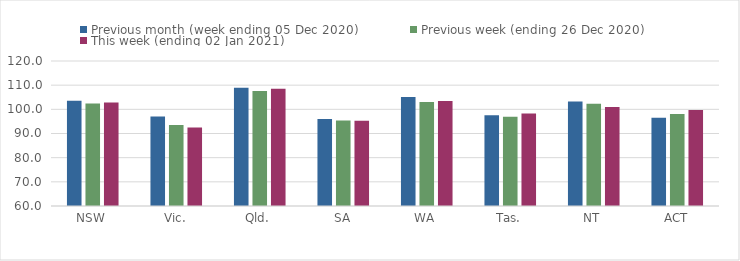
| Category | Previous month (week ending 05 Dec 2020) | Previous week (ending 26 Dec 2020) | This week (ending 02 Jan 2021) |
|---|---|---|---|
| NSW | 103.52 | 102.46 | 102.84 |
| Vic. | 97.01 | 93.55 | 92.44 |
| Qld. | 108.93 | 107.59 | 108.55 |
| SA | 95.96 | 95.38 | 95.29 |
| WA | 105.11 | 102.99 | 103.5 |
| Tas. | 97.53 | 96.94 | 98.32 |
| NT | 103.23 | 102.31 | 101.01 |
| ACT | 96.56 | 98.04 | 99.73 |